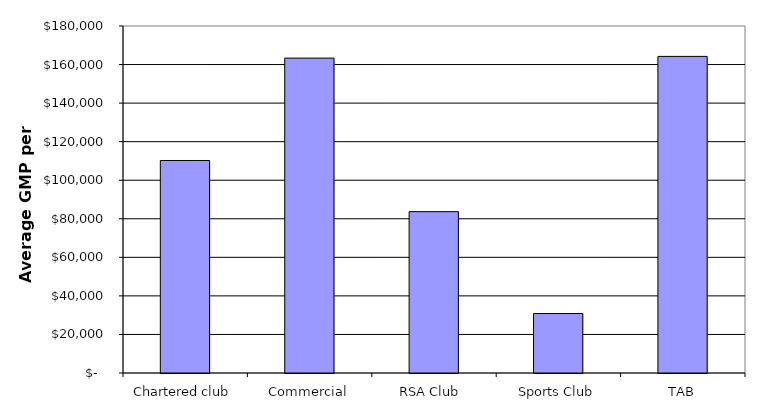
| Category | Series 0 |
|---|---|
| Chartered club | 110236.348 |
| Commercial | 163349.82 |
| RSA Club  | 83697.944 |
| Sports Club | 30852.503 |
| TAB | 164233.572 |